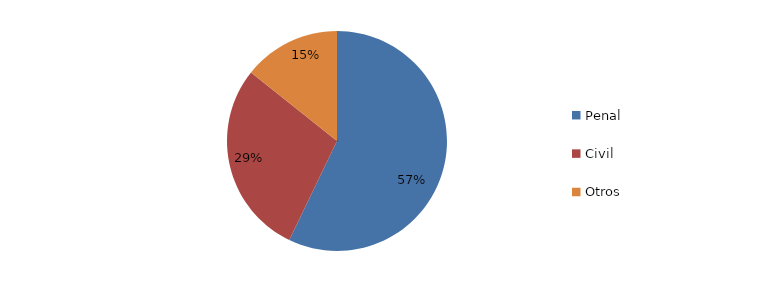
| Category | Series 0 |
|---|---|
| Penal | 4 |
| Civil | 2 |
| Contencioso-Administrativo | 0 |
| Social | 0 |
| Militar | 0 |
| Otros | 1 |